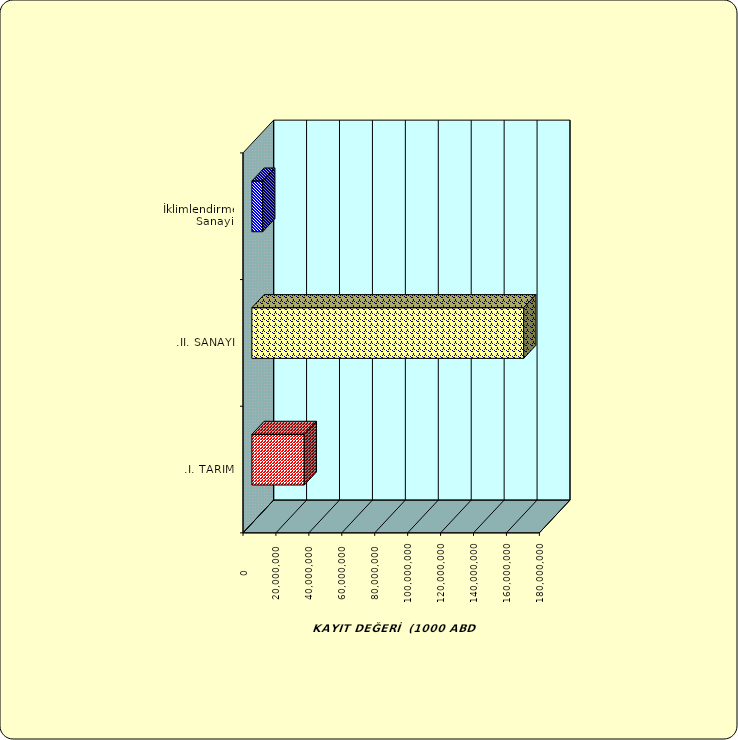
| Category | Series 0 |
|---|---|
| .I. TARIM | 31821895.82 |
| .II. SANAYİ | 165083288.605 |
|  İklimlendirme Sanayii | 6574551.413 |